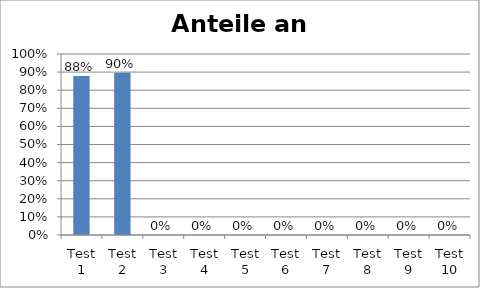
| Category | Series 0 |
|---|---|
| Test 1 | 0.879 |
| Test 2 | 0.896 |
| Test 3 | 0 |
| Test 4 | 0 |
| Test 5 | 0 |
| Test 6 | 0 |
| Test 7 | 0 |
| Test 8 | 0 |
| Test 9 | 0 |
| Test 10 | 0 |